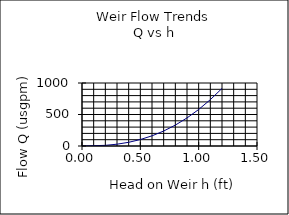
| Category | Series 0 |
|---|---|
| 0.0 | 0 |
| 0.2 | 10.366 |
| 0.3 | 28.565 |
| 0.4 | 58.639 |
| 0.5 | 102.438 |
| 0.6 | 161.59 |
| 0.7 | 237.565 |
| 0.8 | 331.713 |
| 0.9 | 445.29 |
| 1.0 | 579.478 |
| 1.1 | 735.392 |
| 1.2 | 914.092 |